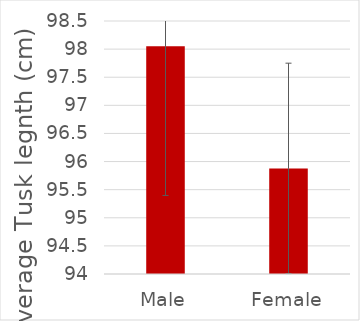
| Category | Series 0 |
|---|---|
| Male | 98.05 |
| Female | 95.878 |